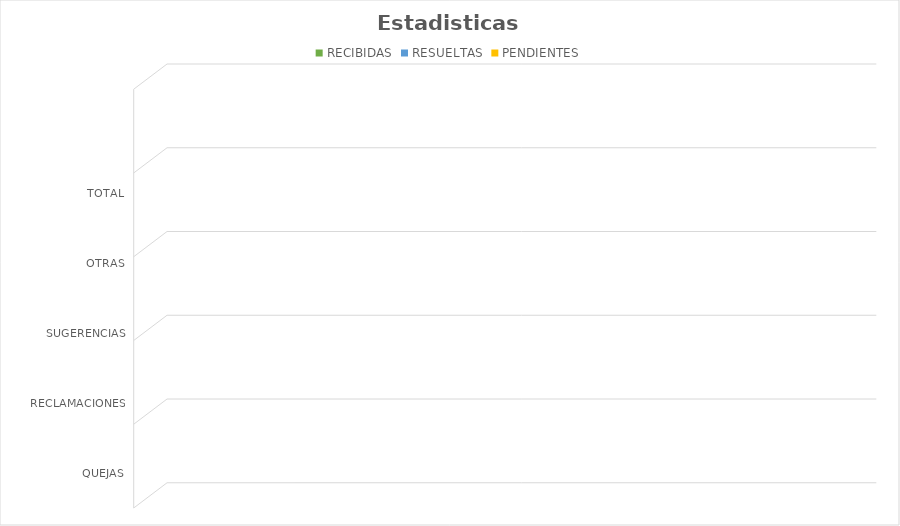
| Category | RECIBIDAS | RESUELTAS | PENDIENTES |
|---|---|---|---|
| QUEJAS | 0 | 0 | 0 |
| RECLAMACIONES | 0 | 0 | 0 |
| SUGERENCIAS | 0 | 0 | 0 |
| OTRAS | 0 | 0 | 0 |
| TOTAL | 0 | 0 | 0 |